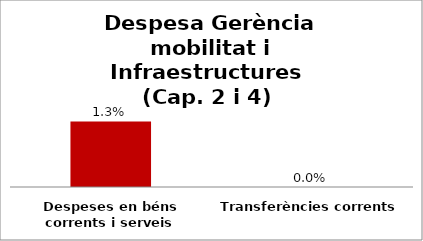
| Category | Series 0 |
|---|---|
| Despeses en béns corrents i serveis | 0.013 |
| Transferències corrents | 0 |